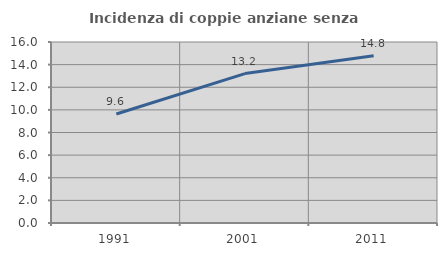
| Category | Incidenza di coppie anziane senza figli  |
|---|---|
| 1991.0 | 9.636 |
| 2001.0 | 13.208 |
| 2011.0 | 14.79 |